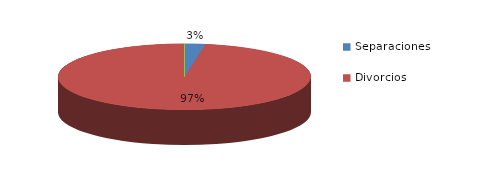
| Category | Series 0 |
|---|---|
| Separaciones | 24 |
| Divorcios | 889 |
| Uniones de hecho | 0 |